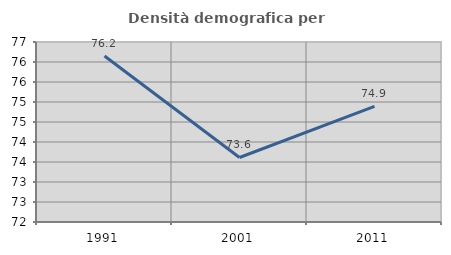
| Category | Densità demografica |
|---|---|
| 1991.0 | 76.151 |
| 2001.0 | 73.613 |
| 2011.0 | 74.889 |